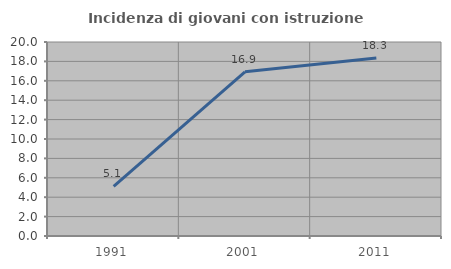
| Category | Incidenza di giovani con istruzione universitaria |
|---|---|
| 1991.0 | 5.109 |
| 2001.0 | 16.923 |
| 2011.0 | 18.349 |